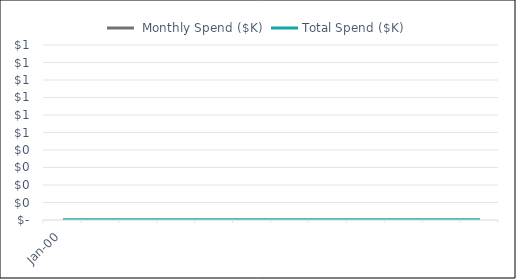
| Category |  Monthly Spend ($K) | Total Spend ($K) |
|---|---|---|
| Jan-00 |  | 0 |
|   |  | 0 |
|   |  | 0 |
|   |  | 0 |
|   |  | 0 |
|   |  | 0 |
|   |  | 0 |
|   |  | 0 |
|   |  | 0 |
|   |  | 0 |
|   |  | 0 |
|   |  | 0 |